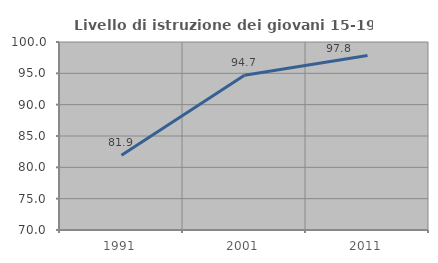
| Category | Livello di istruzione dei giovani 15-19 anni |
|---|---|
| 1991.0 | 81.933 |
| 2001.0 | 94.707 |
| 2011.0 | 97.832 |